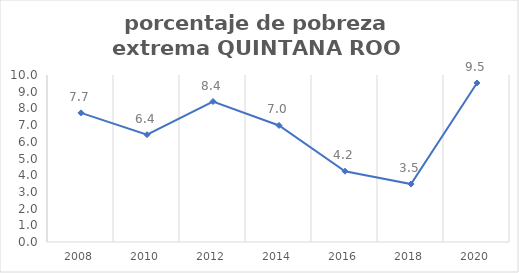
| Category | Series 0 |
|---|---|
| 2008.0 | 7.734 |
| 2010.0 | 6.426 |
| 2012.0 | 8.413 |
| 2014.0 | 6.979 |
| 2016.0 | 4.237 |
| 2018.0 | 3.471 |
| 2020.0 | 9.522 |